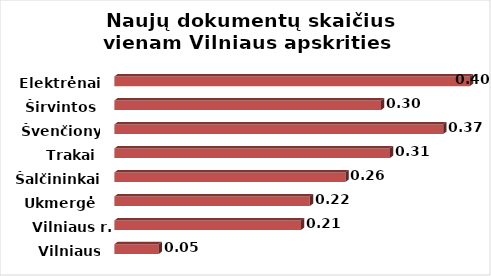
| Category | Series 0 |
|---|---|
| Vilniaus m. | 0.05 |
| Vilniaus r. | 0.21 |
| Ukmergė | 0.22 |
| Šalčininkai | 0.26 |
| Trakai | 0.31 |
| Švenčionys | 0.37 |
| Širvintos | 0.3 |
| Elektrėnai | 0.4 |